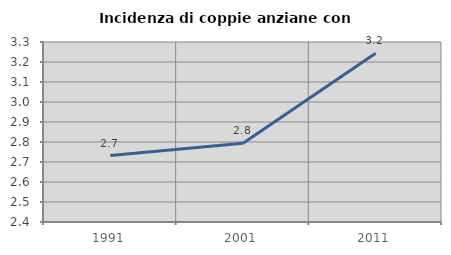
| Category | Incidenza di coppie anziane con figli |
|---|---|
| 1991.0 | 2.732 |
| 2001.0 | 2.793 |
| 2011.0 | 3.243 |